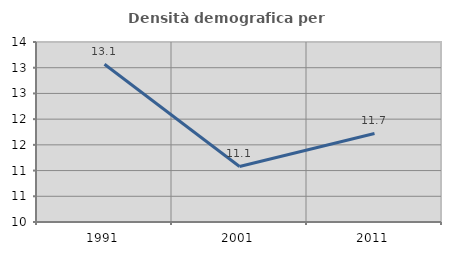
| Category | Densità demografica |
|---|---|
| 1991.0 | 13.066 |
| 2001.0 | 11.081 |
| 2011.0 | 11.721 |